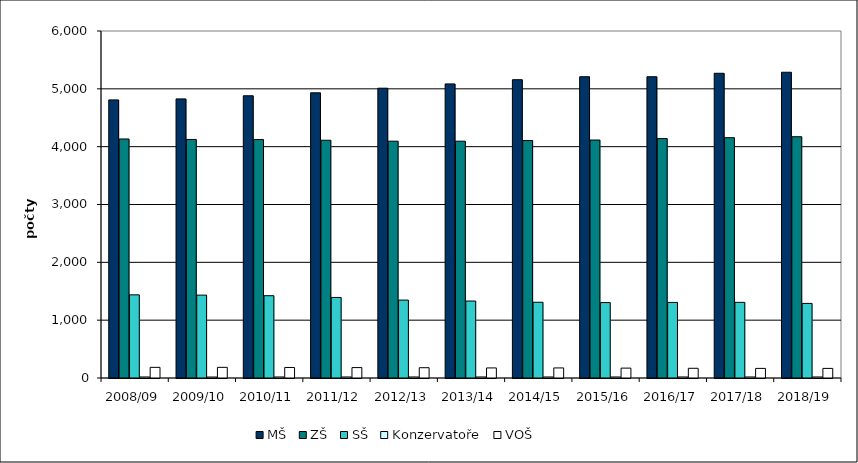
| Category | MŠ | ZŠ | SŠ | Konzervatoře | VOŠ |
|---|---|---|---|---|---|
| 2008/09 | 4809 | 4133 | 1438 | 18 | 184 |
| 2009/10 | 4826 | 4125 | 1433 | 17 | 184 |
| 2010/11 | 4880 | 4123 | 1423 | 18 | 182 |
| 2011/12 | 4931 | 4111 | 1393 | 18 | 180 |
| 2012/13 | 5011 | 4095 | 1347 | 18 | 178 |
| 2013/14 | 5085 | 4095 | 1331 | 18 | 174 |
| 2014/15 | 5158 | 4106 | 1310 | 18 | 174 |
| 2015/16 | 5209 | 4115 | 1304 | 18 | 171 |
| 2016/17 | 5209 | 4140 | 1307 | 18 | 168 |
| 2017/18 | 5269 | 4155 | 1308 | 18 | 166 |
| 2018/19 | 5287 | 4172 | 1290 | 18 | 166 |